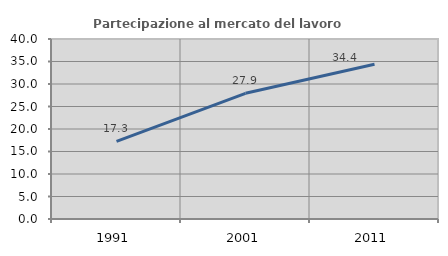
| Category | Partecipazione al mercato del lavoro  femminile |
|---|---|
| 1991.0 | 17.262 |
| 2001.0 | 27.931 |
| 2011.0 | 34.397 |